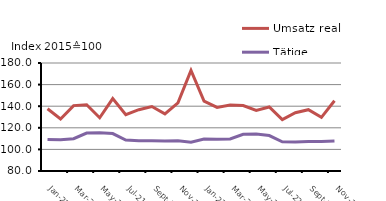
| Category | Umsatz real | Tätige Personen |
|---|---|---|
| 2021-01-01 | 137.61 | 109.26 |
| 2021-02-01 | 128.12 | 108.88 |
| 2021-03-01 | 140.57 | 109.92 |
| 2021-04-01 | 141.37 | 115.16 |
| 2021-05-01 | 129.29 | 115.4 |
| 2021-06-01 | 147.03 | 114.68 |
| 2021-07-01 | 132.18 | 108.59 |
| 2021-08-01 | 136.79 | 107.99 |
| 2021-09-01 | 139.68 | 107.92 |
| 2021-10-01 | 132.92 | 107.67 |
| 2021-11-01 | 143.05 | 108.08 |
| 2021-12-01 | 173.05 | 106.6 |
| 2022-01-01 | 144.72 | 109.61 |
| 2022-02-01 | 138.9 | 109.45 |
| 2022-03-01 | 141.13 | 109.6 |
| 2022-04-01 | 140.63 | 114.05 |
| 2022-05-01 | 136.15 | 114.32 |
| 2022-06-01 | 139.3 | 112.81 |
| 2022-07-01 | 127.62 | 107.03 |
| 2022-08-01 | 133.94 | 106.78 |
| 2022-09-01 | 136.76 | 107.23 |
| 2022-10-01 | 129.67 | 107.24 |
| 2022-11-01 | 145.01 | 107.83 |